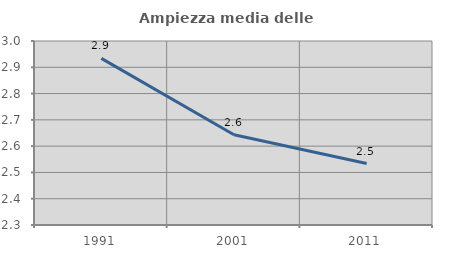
| Category | Ampiezza media delle famiglie |
|---|---|
| 1991.0 | 2.934 |
| 2001.0 | 2.643 |
| 2011.0 | 2.534 |